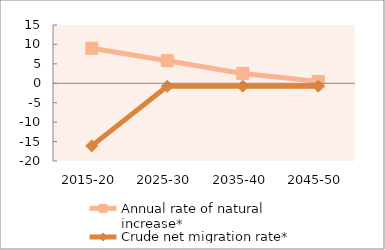
| Category | Annual rate of natural increase* | Crude net migration rate* |
|---|---|---|
| 2015-20 | 9.006 | -16.112 |
| 2025-30 | 5.823 | -0.783 |
| 2035-40 | 2.537 | -0.758 |
| 2045-50 | 0.49 | -0.752 |